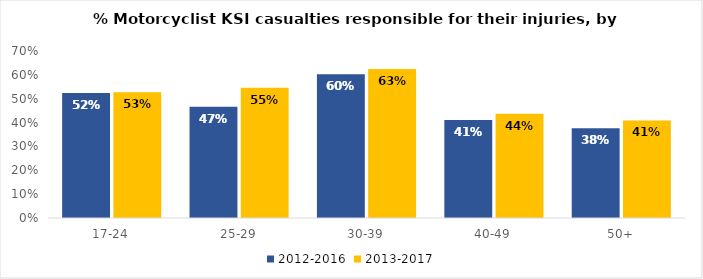
| Category | 2012-2016 | 2013-2017 |
|---|---|---|
| 17-24 | 0.524 | 0.527 |
| 25-29 | 0.467 | 0.545 |
| 30-39 | 0.603 | 0.625 |
| 40-49 | 0.411 | 0.437 |
| 50+ | 0.376 | 0.409 |